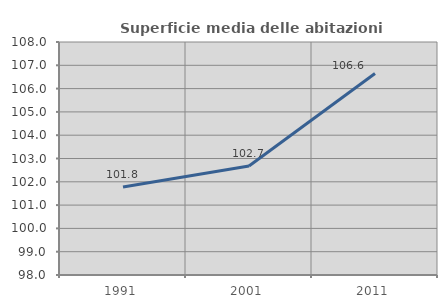
| Category | Superficie media delle abitazioni occupate |
|---|---|
| 1991.0 | 101.777 |
| 2001.0 | 102.676 |
| 2011.0 | 106.649 |